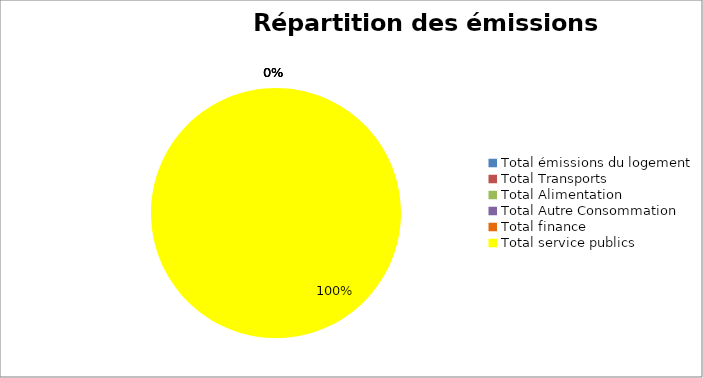
| Category | Series 0 |
|---|---|
| Total émissions du logement | 0 |
| Total Transports | 0 |
| Total Alimentation | 0 |
| Total Autre Consommation  | 0 |
| Total finance | 0 |
| Total service publics | 350.116 |